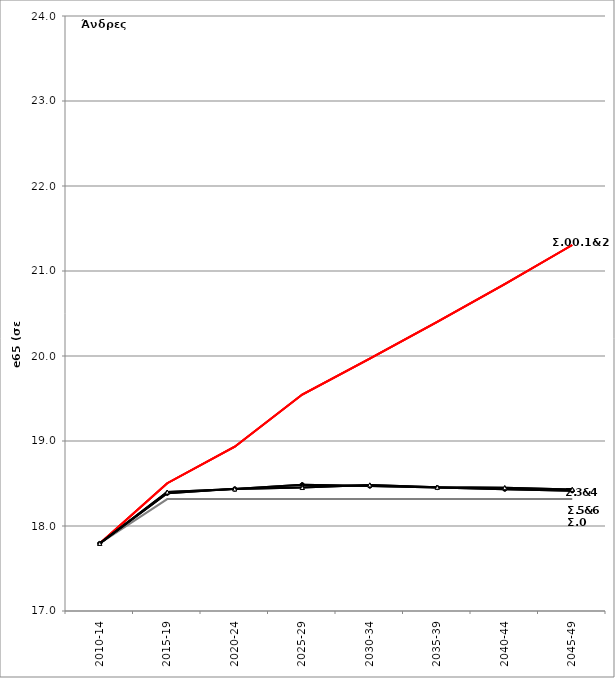
| Category | Σ0.e65 | Σ00.e65 | Σ1.e65 | Σ2.e65 | Σ3.e65 | Σ4.e65 | Σ5.e65 | Σ6.e65 |
|---|---|---|---|---|---|---|---|---|
| 2010-14 | 17.795 | 17.795 | 17.795 | 17.795 | 17.795 | 17.795 | 17.795 | 17.795 |
| 2015-19 | 18.317 | 18.503 | 18.503 | 18.503 | 18.386 | 18.386 | 18.4 | 18.4 |
| 2020-24 | 18.317 | 18.933 | 18.933 | 18.933 | 18.437 | 18.437 | 18.436 | 18.436 |
| 2025-29 | 18.317 | 19.546 | 19.546 | 19.546 | 18.485 | 18.485 | 18.453 | 18.453 |
| 2030-34 | 18.317 | 19.968 | 19.968 | 19.968 | 18.47 | 18.47 | 18.483 | 18.483 |
| 2035-39 | 18.317 | 20.402 | 20.402 | 20.402 | 18.452 | 18.452 | 18.456 | 18.456 |
| 2040-44 | 18.317 | 20.847 | 20.847 | 20.847 | 18.434 | 18.434 | 18.451 | 18.451 |
| 2045-49 | 18.317 | 21.306 | 21.306 | 21.306 | 18.415 | 18.415 | 18.431 | 18.431 |